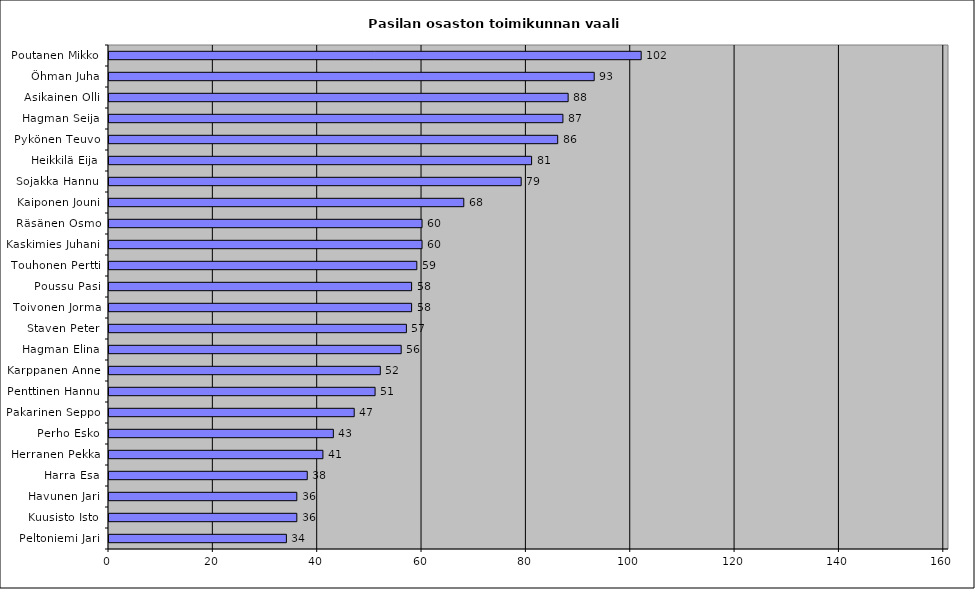
| Category | Series 0 |
|---|---|
| Poutanen Mikko | 102 |
| Öhman Juha | 93 |
| Asikainen Olli | 88 |
| Hagman Seija | 87 |
| Pykönen Teuvo | 86 |
| Heikkilä Eija | 81 |
| Sojakka Hannu | 79 |
| Kaiponen Jouni | 68 |
| Räsänen Osmo | 60 |
| Kaskimies Juhani | 60 |
| Touhonen Pertti | 59 |
| Poussu Pasi | 58 |
| Toivonen Jorma | 58 |
| Staven Peter | 57 |
| Hagman Elina | 56 |
| Karppanen Anne | 52 |
| Penttinen Hannu | 51 |
| Pakarinen Seppo | 47 |
| Perho Esko | 43 |
| Herranen Pekka | 41 |
| Harra Esa | 38 |
| Havunen Jari | 36 |
| Kuusisto Isto | 36 |
| Peltoniemi Jari | 34 |